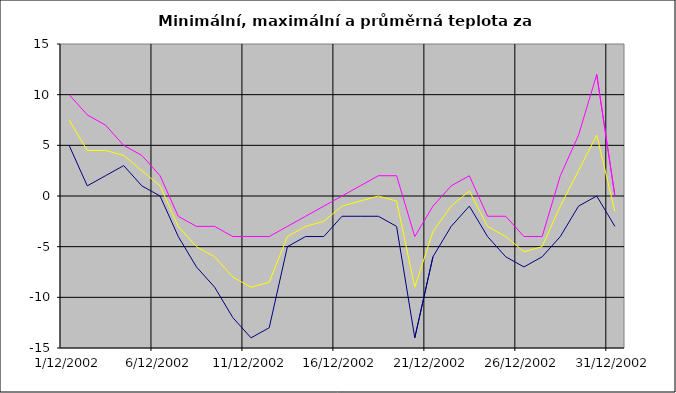
| Category | Series 0 | Series 1 | Series 2 |
|---|---|---|---|
| 2002-12-01 | 5 | 10 | 7.5 |
| 2002-12-02 | 1 | 8 | 4.5 |
| 2002-12-03 | 2 | 7 | 4.5 |
| 2002-12-04 | 3 | 5 | 4 |
| 2002-12-05 | 1 | 4 | 2.5 |
| 2002-12-06 | 0 | 2 | 1 |
| 2002-12-07 | -4 | -2 | -3 |
| 2002-12-08 | -7 | -3 | -5 |
| 2002-12-09 | -9 | -3 | -6 |
| 2002-12-10 | -12 | -4 | -8 |
| 2002-12-11 | -14 | -4 | -9 |
| 2002-12-12 | -13 | -4 | -8.5 |
| 2002-12-13 | -5 | -3 | -4 |
| 2002-12-14 | -4 | -2 | -3 |
| 2002-12-15 | -4 | -1 | -2.5 |
| 2002-12-16 | -2 | 0 | -1 |
| 2002-12-17 | -2 | 1 | -0.5 |
| 2002-12-18 | -2 | 2 | 0 |
| 2002-12-19 | -3 | 2 | -0.5 |
| 2002-12-20 | -14 | -4 | -9 |
| 2002-12-21 | -6 | -1 | -3.5 |
| 2002-12-22 | -3 | 1 | -1 |
| 2002-12-23 | -1 | 2 | 0.5 |
| 2002-12-24 | -4 | -2 | -3 |
| 2002-12-25 | -6 | -2 | -4 |
| 2002-12-26 | -7 | -4 | -5.5 |
| 2002-12-27 | -6 | -4 | -5 |
| 2002-12-28 | -4 | 2 | -1 |
| 2002-12-29 | -1 | 6 | 2.5 |
| 2002-12-30 | 0 | 12 | 6 |
| 2002-12-31 | -3 | 0 | -1.5 |